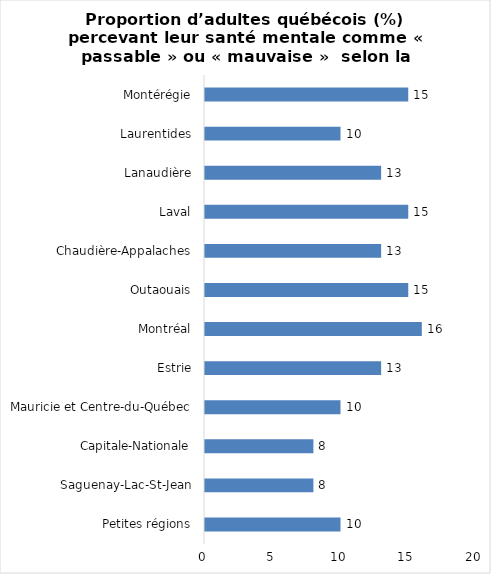
| Category | Series 0 |
|---|---|
| Petites régions | 10 |
| Saguenay-Lac-St-Jean | 8 |
| Capitale-Nationale | 8 |
| Mauricie et Centre-du-Québec | 10 |
| Estrie | 13 |
| Montréal | 16 |
| Outaouais | 15 |
| Chaudière-Appalaches | 13 |
| Laval | 15 |
| Lanaudière | 13 |
| Laurentides | 10 |
| Montérégie | 15 |